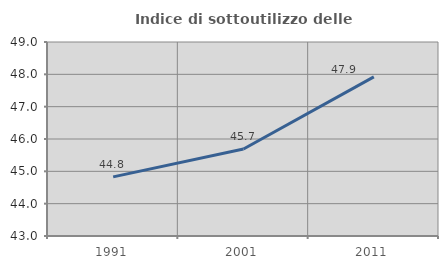
| Category | Indice di sottoutilizzo delle abitazioni  |
|---|---|
| 1991.0 | 44.828 |
| 2001.0 | 45.69 |
| 2011.0 | 47.922 |